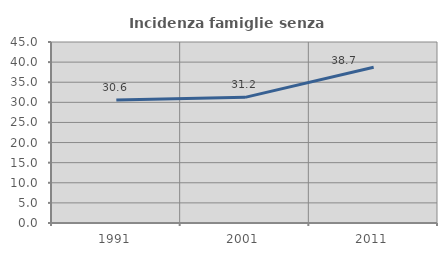
| Category | Incidenza famiglie senza nuclei |
|---|---|
| 1991.0 | 30.556 |
| 2001.0 | 31.242 |
| 2011.0 | 38.737 |